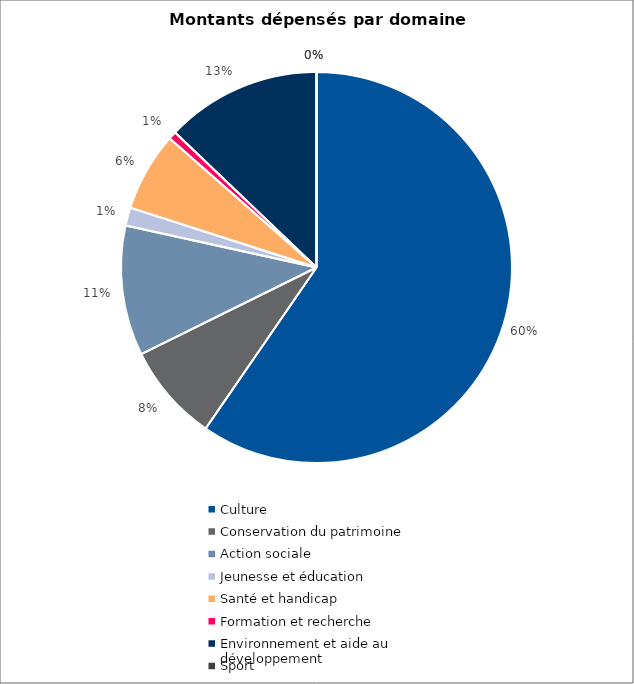
| Category | Series 0 |
|---|---|
| Culture | 17991785 |
| Conservation du patrimoine | 2443000 |
| Action sociale | 3248081 |
| Jeunesse et éducation | 454500 |
| Santé et handicap | 1970500 |
| Formation et recherche | 197000 |
| Environnement et aide au
développement | 3886000 |
| Sport | 0 |
| Autres projets d’utilité publique | 0 |